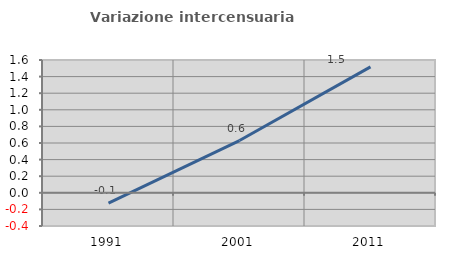
| Category | Variazione intercensuaria annua |
|---|---|
| 1991.0 | -0.125 |
| 2001.0 | 0.629 |
| 2011.0 | 1.517 |